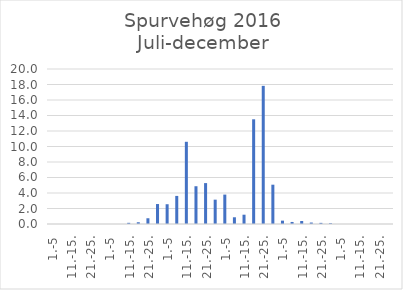
| Category | Series 0 |
|---|---|
| 1.-5 | 0 |
| 6.-10. | 0 |
| 11.-15. | 0 |
| 16.-20. | 0 |
| 21.-25. | 0 |
| 26.-31. | 0 |
| 1.-5 | 0 |
| 6.-10. | 0 |
| 11.-15. | 0.152 |
| 16.-20. | 0.225 |
| 21.-25. | 0.742 |
| 26.-31. | 2.577 |
| 1.-5 | 2.551 |
| 6.-10. | 3.624 |
| 11.-15. | 10.608 |
| 16.-20. | 4.874 |
| 21.-25. | 5.278 |
| 26.-30. | 3.14 |
| 1.-5 | 3.794 |
| 6.-10. | 0.867 |
| 11.-15. | 1.2 |
| 16.-20. | 13.51 |
| 21.-25. | 17.826 |
| 26.-31. | 5.072 |
| 1.-5 | 0.434 |
| 6.-10. | 0.263 |
| 11.-15. | 0.385 |
| 16.-20. | 0.189 |
| 21.-25. | 0.146 |
| 26.-30. | 0.1 |
| 1.-5 | 0 |
| 6.-10. | 0 |
| 11.-15. | 0 |
| 16.-20. | 0 |
| 21.-25. | 0 |
| 26.-31. | 0 |